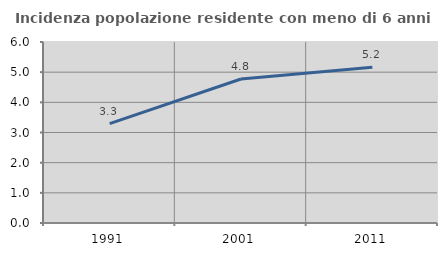
| Category | Incidenza popolazione residente con meno di 6 anni |
|---|---|
| 1991.0 | 3.297 |
| 2001.0 | 4.775 |
| 2011.0 | 5.165 |